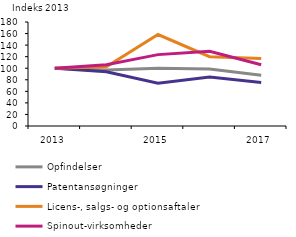
| Category | Opfindelser | Patentansøgninger | Licens-, salgs- og optionsaftaler | Spinout-virksomheder |
|---|---|---|---|---|
| 2013.0 | 100 | 100 | 100 | 100 |
| 2014.0 | 96.868 | 93.846 | 102.5 | 105.882 |
| 2015.0 | 99.791 | 73.846 | 158.333 | 123.529 |
| 2016.0 | 98.747 | 84.615 | 120 | 129.412 |
| 2017.0 | 87.891 | 75.385 | 116.667 | 105.882 |